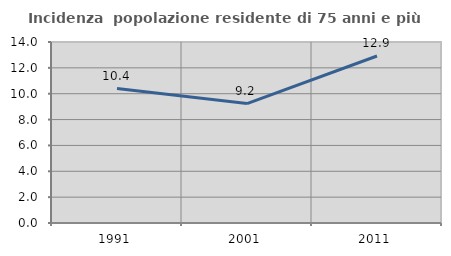
| Category | Incidenza  popolazione residente di 75 anni e più |
|---|---|
| 1991.0 | 10.4 |
| 2001.0 | 9.235 |
| 2011.0 | 12.919 |